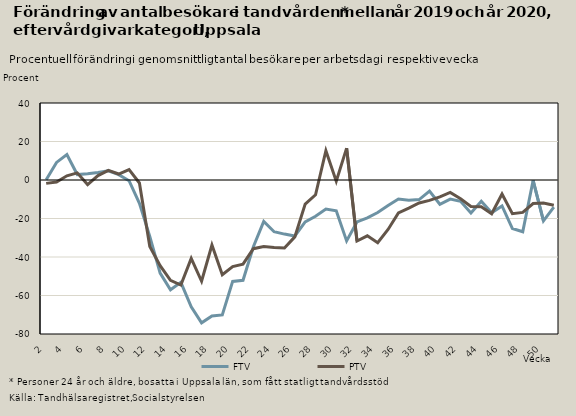
| Category | FTV | PTV |
|---|---|---|
| 2.0 | 0.086 | -1.754 |
| 3.0 | 9.146 | -1.017 |
| 4.0 | 13.272 | 2.171 |
| 5.0 | 2.83 | 3.718 |
| 6.0 | 3.276 | -2.357 |
| 7.0 | 3.951 | 2.295 |
| 8.0 | 4.753 | 5.028 |
| 9.0 | 2.794 | 3.108 |
| 10.0 | -0.369 | 5.404 |
| 11.0 | -12.153 | -1.536 |
| 12.0 | -29.271 | -34.575 |
| 13.0 | -48.33 | -44.504 |
| 14.0 | -57.022 | -52.139 |
| 15.0 | -53.179 | -54.551 |
| 16.0 | -65.897 | -40.711 |
| 17.0 | -74.189 | -52.606 |
| 18.0 | -70.62 | -33.777 |
| 19.0 | -70.07 | -49.217 |
| 20.0 | -52.679 | -44.972 |
| 21.0 | -52.106 | -43.721 |
| 22.0 | -34.661 | -35.693 |
| 23.0 | -21.497 | -34.516 |
| 24.0 | -26.881 | -35.123 |
| 25.0 | -28.099 | -35.292 |
| 26.0 | -29.09 | -29.546 |
| 27.0 | -21.741 | -12.538 |
| 28.0 | -18.849 | -7.692 |
| 29.0 | -15.115 | 15.226 |
| 30.0 | -16.03 | -0.623 |
| 31.0 | -31.642 | 16.571 |
| 32.0 | -21.802 | -31.692 |
| 33.0 | -19.681 | -28.992 |
| 34.0 | -16.902 | -32.563 |
| 35.0 | -13.263 | -25.697 |
| 36.0 | -9.892 | -17.135 |
| 37.0 | -10.466 | -14.615 |
| 38.0 | -10.152 | -11.921 |
| 39.0 | -5.767 | -10.573 |
| 40.0 | -12.6 | -8.81 |
| 41.0 | -9.911 | -6.483 |
| 42.0 | -11.042 | -9.749 |
| 43.0 | -17.117 | -13.756 |
| 44.0 | -11.093 | -13.865 |
| 45.0 | -17.033 | -17.531 |
| 46.0 | -13.458 | -7.286 |
| 47.0 | -25.196 | -17.521 |
| 48.0 | -26.873 | -16.839 |
| 49.0 | -0.229 | -12.211 |
| 50.0 | -21.187 | -11.995 |
| 51.0 | -14.097 | -13.148 |